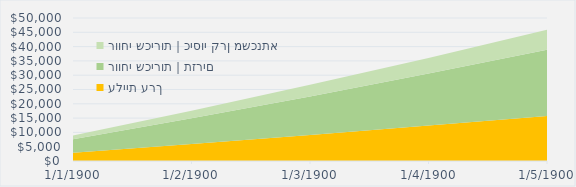
| Category | עליית ערך | רווחי שכירות | תזרים | רווחי שכירות | כיסוי קרן משכנתא |
|---|---|---|---|
| 0 | 2925 | 4680.646 | 1322.614 |
| 1 | 5959.688 | 8956.916 | 2675.297 |
| 2 | 9108.176 | 13459.328 | 4058.73 |
| 3 | 12374.732 | 18193.533 | 5473.613 |
| 4 | 15763.785 | 23165.328 | 6920.662 |